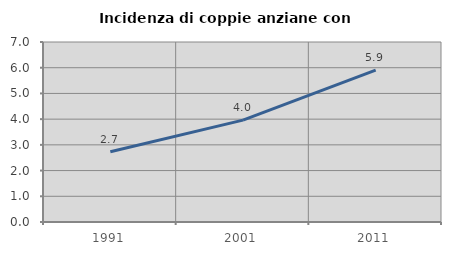
| Category | Incidenza di coppie anziane con figli |
|---|---|
| 1991.0 | 2.731 |
| 2001.0 | 3.963 |
| 2011.0 | 5.906 |